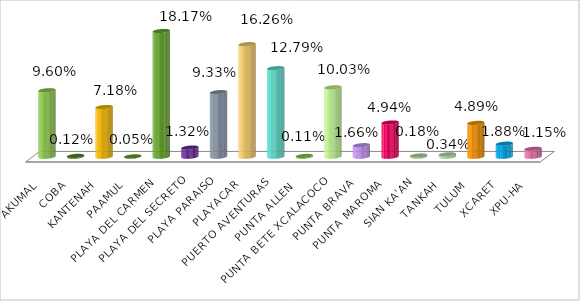
| Category | AKUMAL COBA KANTENAH PAAMUL PLAYA DEL CARMEN PLAYA DEL SECRETO PLAYA PARAISO PLAYACAR PUERTO AVENTURAS PUNTA ALLEN  PUNTA BETE XCALACOCO PUNTA BRAVA PUNTA MAROMA SIAN KA'AN TANKAH TULUM XCARET XPU-HA |
|---|---|
| AKUMAL | 0.096 |
| COBA | 0.001 |
| KANTENAH | 0.072 |
| PAAMUL | 0 |
| PLAYA DEL CARMEN | 0.182 |
| PLAYA DEL SECRETO | 0.013 |
| PLAYA PARAISO | 0.093 |
| PLAYACAR | 0.163 |
| PUERTO AVENTURAS | 0.128 |
| PUNTA ALLEN  | 0.001 |
| PUNTA BETE XCALACOCO | 0.1 |
| PUNTA BRAVA | 0.017 |
| PUNTA MAROMA | 0.049 |
| SIAN KA'AN | 0.002 |
| TANKAH | 0.003 |
| TULUM | 0.049 |
| XCARET | 0.019 |
| XPU-HA | 0.011 |